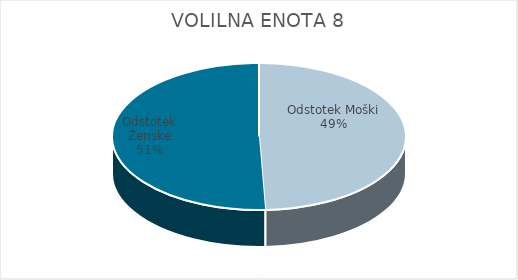
| Category | VOLILNA ENOTA 8 | #REF! | Slovenija skupaj |
|---|---|---|---|
| Odstotek Moški | 31.59 |  | 33.67 |
| Odstotek Ženske | 32.45 |  | 35.97 |